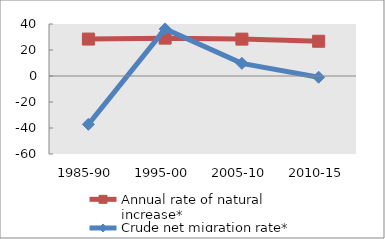
| Category | Annual rate of natural increase* | Crude net migration rate* |
|---|---|---|
| 1985-90 | 28.41 | -37.207 |
| 1995-00 | 29.127 | 36.204 |
| 2005-10 | 28.369 | 9.717 |
| 2010-15 | 26.73 | -0.945 |